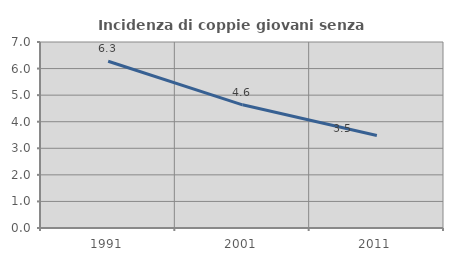
| Category | Incidenza di coppie giovani senza figli |
|---|---|
| 1991.0 | 6.275 |
| 2001.0 | 4.636 |
| 2011.0 | 3.478 |